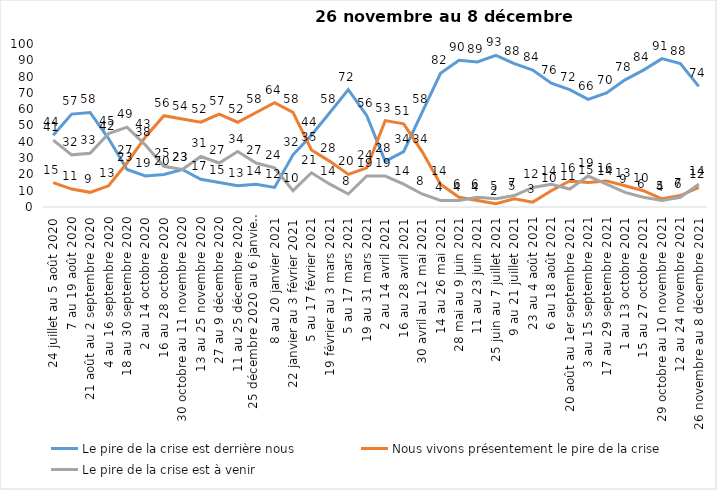
| Category | Le pire de la crise est derrière nous | Nous vivons présentement le pire de la crise | Le pire de la crise est à venir |
|---|---|---|---|
| 24 juillet au 5 août 2020 | 44 | 15 | 41 |
| 7 au 19 août 2020 | 57 | 11 | 32 |
| 21 août au 2 septembre 2020 | 58 | 9 | 33 |
| 4 au 16 septembre 2020 | 42 | 13 | 45 |
| 18 au 30 septembre 2020 | 23 | 27 | 49 |
| 2 au 14 octobre 2020 | 19 | 43 | 38 |
| 16 au 28 octobre 2020 | 20 | 56 | 25 |
| 30 octobre au 11 novembre 2020 | 23 | 54 | 23 |
| 13 au 25 novembre 2020 | 17 | 52 | 31 |
| 27 au 9 décembre 2020 | 15 | 57 | 27 |
| 11 au 25 décembre 2020 | 13 | 52 | 34 |
| 25 décembre 2020 au 6 janvier 2021 | 14 | 58 | 27 |
| 8 au 20 janvier 2021 | 12 | 64 | 24 |
| 22 janvier au 3 février 2021 | 32 | 58 | 10 |
| 5 au 17 février 2021 | 44 | 35 | 21 |
| 19 février au 3 mars 2021 | 58 | 28 | 14 |
| 5 au 17 mars 2021 | 72 | 20 | 8 |
| 19 au 31 mars 2021 | 56 | 24 | 19 |
| 2 au 14 avril 2021 | 28 | 53 | 19 |
| 16 au 28 avril 2021 | 34 | 51 | 14 |
| 30 avril au 12 mai 2021 | 58 | 34 | 8 |
| 14 au 26 mai 2021 | 82 | 14 | 4 |
| 28 mai au 9 juin 2021 | 90 | 6 | 4 |
| 11 au 23 juin 2021 | 89 | 4 | 6 |
| 25 juin au 7 juillet 2021 | 93 | 2 | 5 |
| 9 au 21 juillet 2021 | 88 | 5 | 7 |
| 23 au 4 août 2021 | 84 | 3 | 12 |
| 6 au 18 août 2021 | 76 | 10 | 14 |
| 20 août au 1er septembre 2021 | 72 | 16 | 11 |
| 3 au 15 septembre 2021 | 66 | 15 | 19 |
| 17 au 29 septembre 2021 | 70 | 16 | 14 |
| 1 au 13 octobre 2021 | 78 | 13 | 9 |
| 15 au 27 octobre 2021 | 84 | 10 | 6 |
| 29 octobre au 10 novembre 2021 | 91 | 5 | 4 |
| 12 au 24 novembre 2021 | 88 | 7 | 6 |
| 26 novembre au 8 décembre 2021 | 74 | 12 | 14 |